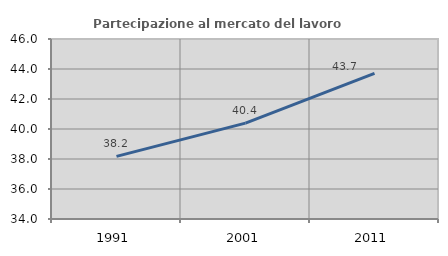
| Category | Partecipazione al mercato del lavoro  femminile |
|---|---|
| 1991.0 | 38.177 |
| 2001.0 | 40.389 |
| 2011.0 | 43.706 |